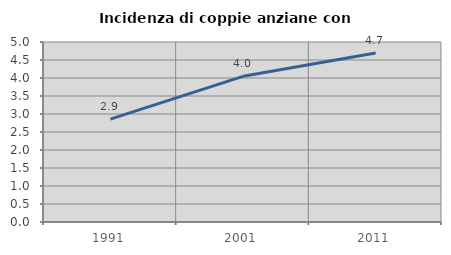
| Category | Incidenza di coppie anziane con figli |
|---|---|
| 1991.0 | 2.859 |
| 2001.0 | 4.046 |
| 2011.0 | 4.693 |